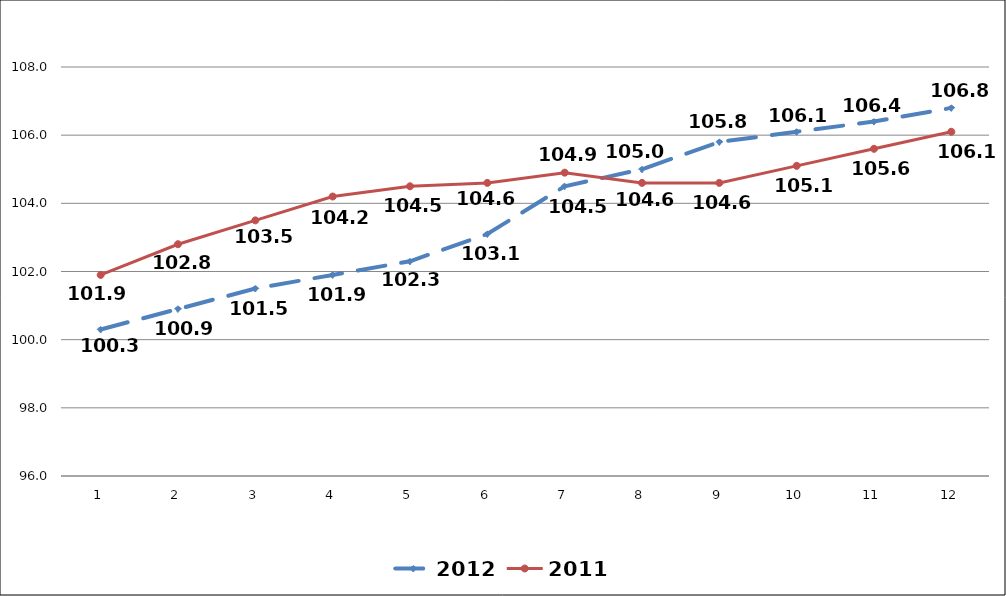
| Category | 2012 | 2011 |
|---|---|---|
| 0 | 100.3 | 101.9 |
| 1 | 100.9 | 102.8 |
| 2 | 101.5 | 103.5 |
| 3 | 101.9 | 104.2 |
| 4 | 102.3 | 104.5 |
| 5 | 103.1 | 104.6 |
| 6 | 104.5 | 104.9 |
| 7 | 105 | 104.6 |
| 8 | 105.8 | 104.6 |
| 9 | 106.1 | 105.1 |
| 10 | 106.4 | 105.6 |
| 11 | 106.8 | 106.1 |